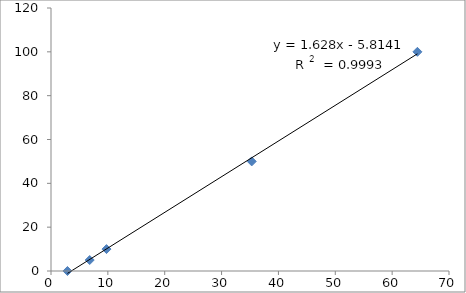
| Category | Series 0 |
|---|---|
| 2.893 | 0 |
| 6.808 | 5 |
| 9.76 | 10 |
| 35.302 | 50 |
| 64.444 | 100 |